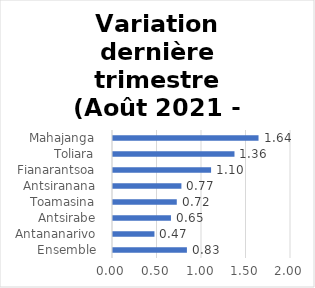
| Category | Variation dernière trimestre |
|---|---|
|  Ensemble  | 0.83 |
|  Antananarivo  | 0.466 |
|  Antsirabe  | 0.651 |
|  Toamasina  | 0.717 |
|  Antsiranana  | 0.769 |
|  Fianarantsoa  | 1.102 |
|  Toliara  | 1.365 |
|  Mahajanga  | 1.635 |